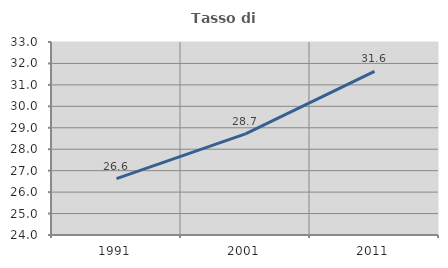
| Category | Tasso di occupazione   |
|---|---|
| 1991.0 | 26.629 |
| 2001.0 | 28.715 |
| 2011.0 | 31.633 |